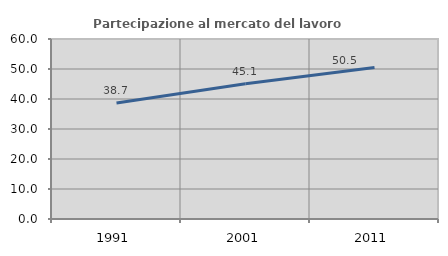
| Category | Partecipazione al mercato del lavoro  femminile |
|---|---|
| 1991.0 | 38.703 |
| 2001.0 | 45.07 |
| 2011.0 | 50.494 |